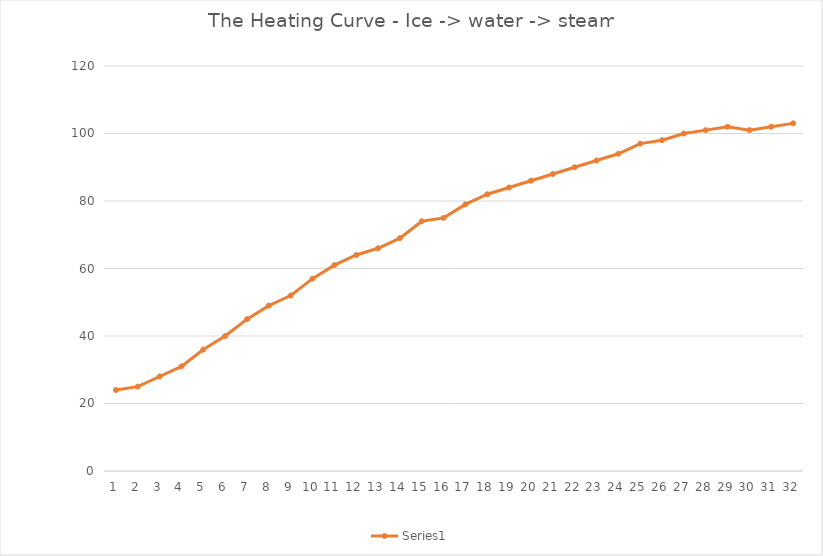
| Category | Series 1 |
|---|---|
| 0 | 24 |
| 1 | 25 |
| 2 | 28 |
| 3 | 31 |
| 4 | 36 |
| 5 | 40 |
| 6 | 45 |
| 7 | 49 |
| 8 | 52 |
| 9 | 57 |
| 10 | 61 |
| 11 | 64 |
| 12 | 66 |
| 13 | 69 |
| 14 | 74 |
| 15 | 75 |
| 16 | 79 |
| 17 | 82 |
| 18 | 84 |
| 19 | 86 |
| 20 | 88 |
| 21 | 90 |
| 22 | 92 |
| 23 | 94 |
| 24 | 97 |
| 25 | 98 |
| 26 | 100 |
| 27 | 101 |
| 28 | 102 |
| 29 | 101 |
| 30 | 102 |
| 31 | 103 |